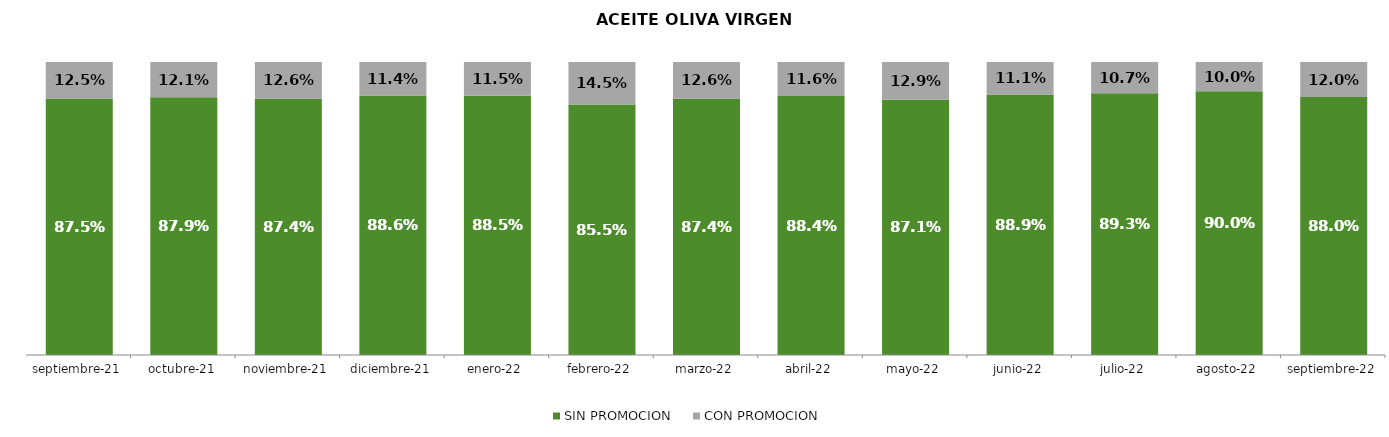
| Category | SIN PROMOCION   | CON PROMOCION   |
|---|---|---|
| 2021-09-01 | 0.875 | 0.125 |
| 2021-10-01 | 0.879 | 0.121 |
| 2021-11-01 | 0.874 | 0.126 |
| 2021-12-01 | 0.886 | 0.114 |
| 2022-01-01 | 0.885 | 0.115 |
| 2022-02-01 | 0.855 | 0.145 |
| 2022-03-01 | 0.874 | 0.126 |
| 2022-04-01 | 0.884 | 0.116 |
| 2022-05-01 | 0.871 | 0.129 |
| 2022-06-01 | 0.889 | 0.111 |
| 2022-07-01 | 0.893 | 0.107 |
| 2022-08-01 | 0.9 | 0.1 |
| 2022-09-01 | 0.88 | 0.12 |